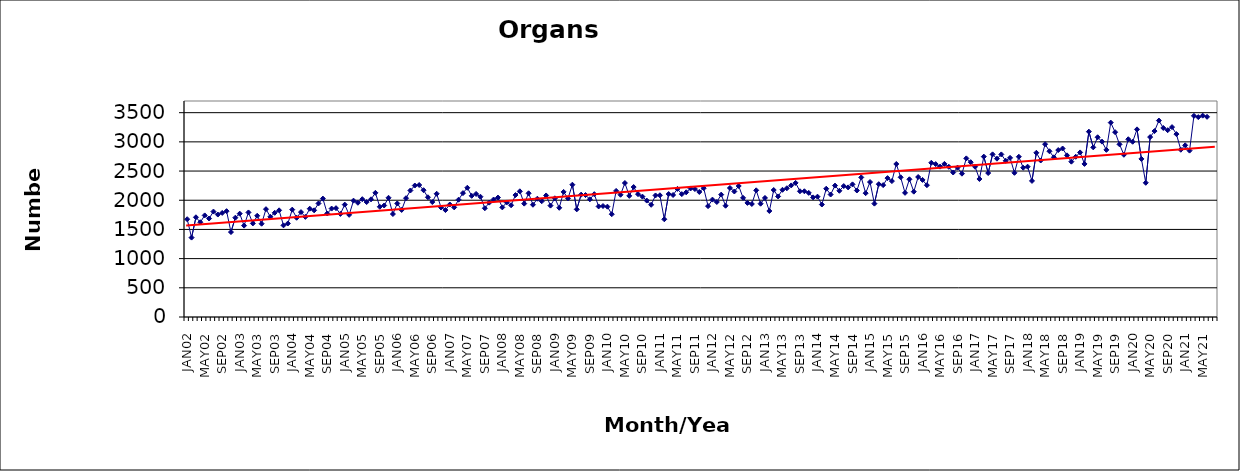
| Category | Series 0 |
|---|---|
| JAN02 | 1675 |
| FEB02 | 1360 |
| MAR02 | 1708 |
| APR02 | 1623 |
| MAY02 | 1740 |
| JUN02 | 1687 |
| JUL02 | 1806 |
| AUG02 | 1755 |
| SEP02 | 1783 |
| OCT02 | 1813 |
| NOV02 | 1455 |
| DEC02 | 1701 |
| JAN03 | 1770 |
| FEB03 | 1565 |
| MAR03 | 1791 |
| APR03 | 1603 |
| MAY03 | 1734 |
| JUN03 | 1598 |
| JUL03 | 1847 |
| AUG03 | 1716 |
| SEP03 | 1785 |
| OCT03 | 1827 |
| NOV03 | 1570 |
| DEC03 | 1602 |
| JAN04 | 1839 |
| FEB04 | 1700 |
| MAR04 | 1797 |
| APR04 | 1715 |
| MAY04 | 1855 |
| JUN04 | 1827 |
| JUL04 | 1945 |
| AUG04 | 2028 |
| SEP04 | 1773 |
| OCT04 | 1857 |
| NOV04 | 1864 |
| DEC04 | 1766 |
| JAN05 | 1925 |
| FEB05 | 1750 |
| MAR05 | 1993 |
| APR05 | 1957 |
| MAY05 | 2018 |
| JUN05 | 1969 |
| JUL05 | 2016 |
| AUG05 | 2127 |
| SEP05 | 1888 |
| OCT05 | 1910 |
| NOV05 | 2042 |
| DEC05 | 1764 |
| JAN06 | 1945 |
| FEB06 | 1834 |
| MAR06 | 2035 |
| APR06 | 2167 |
| MAY06 | 2252 |
| JUN06 | 2261 |
| JUL06 | 2172 |
| AUG06 | 2051 |
| SEP06 | 1969 |
| OCT06 | 2111 |
| NOV06 | 1875 |
| DEC06 | 1832 |
| JAN07 | 1927 |
| FEB07 | 1878 |
| MAR07 | 2009 |
| APR07 | 2122 |
| MAY07 | 2214 |
| JUN07 | 2076 |
| JUL07 | 2108 |
| AUG07 | 2060 |
| SEP07 | 1863 |
| OCT07 | 1959 |
| NOV07 | 2012 |
| DEC07 | 2046 |
| JAN08 | 1878 |
| FEB08 | 1962 |
| MAR08 | 1914 |
| APR08 | 2089 |
| MAY08 | 2153 |
| JUN08 | 1942 |
| JUL08 | 2119 |
| AUG08 | 1923 |
| SEP08 | 2026 |
| OCT08 | 1983 |
| NOV08 | 2082 |
| DEC08 | 1908 |
| JAN09 | 2033 |
| FEB09 | 1871 |
| MAR09 | 2143 |
| APR09 | 2032 |
| MAY09 | 2266 |
| JUN09 | 1844 |
| JUL09 | 2096 |
| AUG09 | 2089 |
| SEP09 | 2016 |
| OCT09 | 2104 |
| NOV09 | 1894 |
| DEC09 | 1901 |
| JAN10 | 1890 |
| FEB10 | 1761 |
| MAR10 | 2160 |
| APR10 | 2094 |
| MAY10 | 2295 |
| JUN10 | 2075 |
| JUL10 | 2226 |
| AUG10 | 2104 |
| SEP10 | 2062 |
| OCT10 | 1994 |
| NOV10 | 1922 |
| DEC10 | 2082 |
| JAN11 | 2085 |
| FEB11 | 1674 |
| MAR11 | 2106 |
| APR11 | 2090 |
| MAY11 | 2194 |
| JUN11 | 2105 |
| JUL11 | 2136 |
| AUG11 | 2202 |
| SEP11 | 2192 |
| OCT11 | 2142 |
| NOV11 | 2207 |
| DEC11 | 1899 |
| JAN12 | 2011 |
| FEB12 | 1970 |
| MAR12 | 2096 |
| APR12 | 1906 |
| MAY12 | 2210 |
| JUN12 | 2150 |
| JUL12 | 2244 |
| AUG12 | 2041 |
| SEP12 | 1954 |
| OCT12 | 1936 |
| NOV12 | 2170 |
| DEC12 | 1941 |
| JAN13 | 2039 |
| FEB13 | 1816 |
| MAR13 | 2175 |
| APR13 | 2065 |
| MAY13 | 2179 |
| JUN13 | 2205 |
| JUL13 | 2254 |
| AUG13 | 2297 |
| SEP13 | 2154 |
| OCT13 | 2154 |
| NOV13 | 2126 |
| DEC13 | 2049 |
| JAN14 | 2061 |
| FEB14 | 1927 |
| MAR14 | 2197 |
| APR14 | 2098 |
| MAY14 | 2251 |
| JUN14 | 2162 |
| JUL14 | 2243 |
| AUG14 | 2220 |
| SEP14 | 2272 |
| OCT14 | 2167 |
| NOV14 | 2391 |
| DEC14 | 2121 |
| JAN15 | 2312 |
| FEB15 | 1942 |
| MAR15 | 2275 |
| APR15 | 2259 |
| MAY15 | 2379 |
| JUN15 | 2328 |
| JUL15 | 2621 |
| AUG15 | 2393 |
| SEP15 | 2127 |
| OCT15 | 2359 |
| NOV15 | 2147 |
| DEC15 | 2398 |
| JAN16 | 2348 |
| FEB16 | 2258 |
| MAR16 | 2642 |
| APR16 | 2619 |
| MAY16 | 2576 |
| JUN16 | 2623 |
| JUL16 | 2573 |
| AUG16 | 2475 |
| SEP16 | 2559 |
| OCT16 | 2455 |
| NOV16 | 2717 |
| DEC16 | 2652 |
| JAN17 | 2574 |
| FEB17 | 2364 |
| MAR17 | 2747 |
| APR17 | 2466 |
| MAY17 | 2786 |
| JUN17 | 2712 |
| JUL17 | 2785 |
| AUG17 | 2676 |
| SEP17 | 2726 |
| OCT17 | 2470 |
| NOV17 | 2745 |
| DEC17 | 2557 |
| JAN18 | 2575 |
| FEB18 | 2331 |
| MAR18 | 2813 |
| APR18 | 2681 |
| MAY18 | 2960 |
| JUN18 | 2839 |
| JUL18 | 2735 |
| AUG18 | 2860 |
| SEP18 | 2886 |
| OCT18 | 2769 |
| NOV18 | 2661 |
| DEC18 | 2745 |
| JAN19 | 2819 |
| FEB19 | 2622 |
| MAR19 | 3175 |
| APR19 | 2906 |
| MAY19 | 3079 |
| JUN19 | 3004 |
| JUL19 | 2863 |
| AUG19 | 3330 |
| SEP19 | 3166 |
| OCT19 | 2958 |
| NOV19 | 2779 |
| DEC19 | 3045 |
| JAN20 | 3002 |
| FEB20 | 3214 |
| MAR20 | 2708 |
| APR20 | 2299 |
| MAY20 | 3082 |
| JUN20 | 3185 |
| JUL20 | 3365 |
| AUG20 | 3238 |
| SEP20 | 3200 |
| OCT20 | 3253 |
| NOV20 | 3133 |
| DEC20 | 2865 |
| JAN21 | 2941 |
| FEB21 | 2850 |
| MAR21 | 3446 |
| APR21 | 3424 |
| MAY21 | 3449 |
| JUN21 | 3429 |